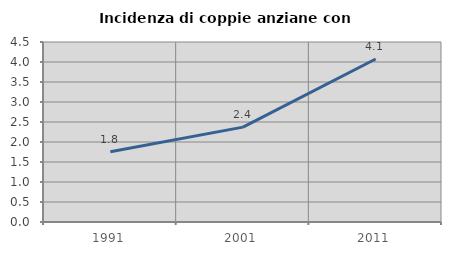
| Category | Incidenza di coppie anziane con figli |
|---|---|
| 1991.0 | 1.758 |
| 2001.0 | 2.372 |
| 2011.0 | 4.075 |